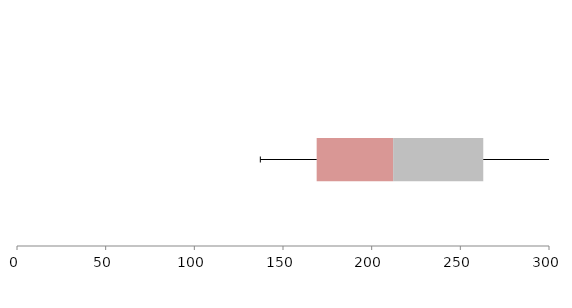
| Category | Series 1 | Series 2 | Series 3 |
|---|---|---|---|
| 0 | 168.987 | 43.12 | 50.823 |